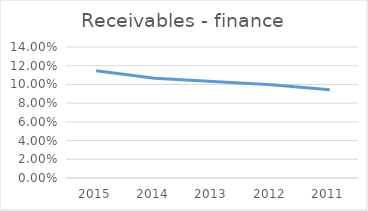
| Category | Receivables - finance |
|---|---|
| 2015.0 | 0.115 |
| 2014.0 | 0.107 |
| 2013.0 | 0.103 |
| 2012.0 | 0.1 |
| 2011.0 | 0.094 |